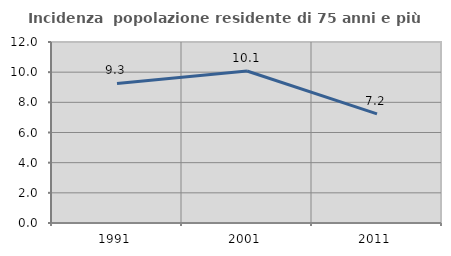
| Category | Incidenza  popolazione residente di 75 anni e più |
|---|---|
| 1991.0 | 9.251 |
| 2001.0 | 10.076 |
| 2011.0 | 7.232 |